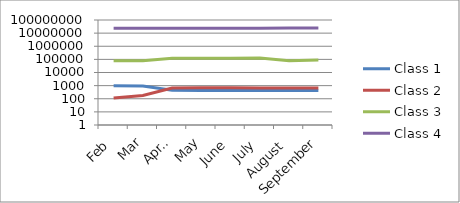
| Category | Class 1 | Class 2 | Class 3 | Class 4 |
|---|---|---|---|---|
| Feb | 990 | 115 | 78345 | 23986004 |
| Mar | 930 | 179 | 80084 | 23996449 |
| April | 449 | 663 | 119857 | 23975239 |
| May | 420 | 686 | 121241 | 23988139 |
| June | 422 | 687 | 123483 | 24005430 |
| July | 427 | 658 | 125491 | 24038014 |
| August | 427 | 655 | 78827 | 24101362 |
| September | 429 | 650 | 88860 | 24110132 |